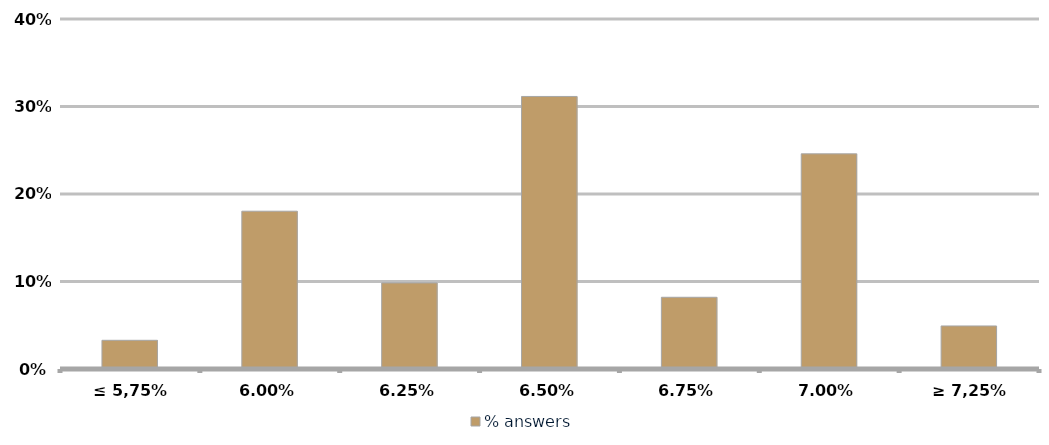
| Category | % answers |
|---|---|
| ≤ 5,75% | 0.033 |
| 6,00% | 0.18 |
| 6,25% | 0.098 |
| 6,50% | 0.311 |
| 6,75% | 0.082 |
| 7,00% | 0.246 |
| ≥ 7,25% | 0.049 |